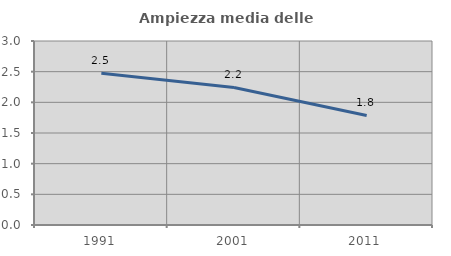
| Category | Ampiezza media delle famiglie |
|---|---|
| 1991.0 | 2.476 |
| 2001.0 | 2.242 |
| 2011.0 | 1.786 |